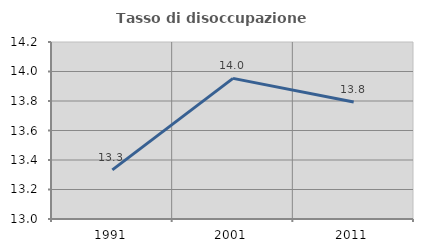
| Category | Tasso di disoccupazione giovanile  |
|---|---|
| 1991.0 | 13.333 |
| 2001.0 | 13.953 |
| 2011.0 | 13.793 |